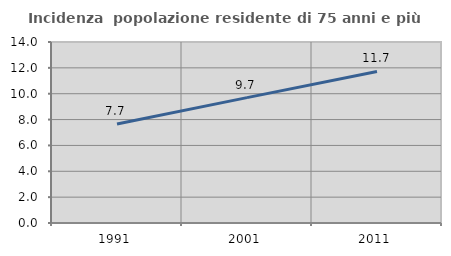
| Category | Incidenza  popolazione residente di 75 anni e più |
|---|---|
| 1991.0 | 7.66 |
| 2001.0 | 9.696 |
| 2011.0 | 11.725 |